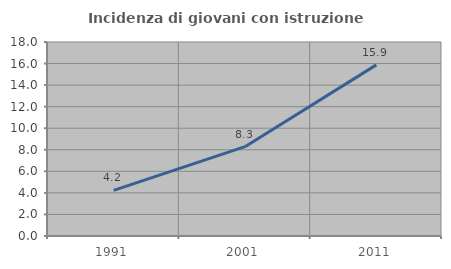
| Category | Incidenza di giovani con istruzione universitaria |
|---|---|
| 1991.0 | 4.231 |
| 2001.0 | 8.29 |
| 2011.0 | 15.877 |